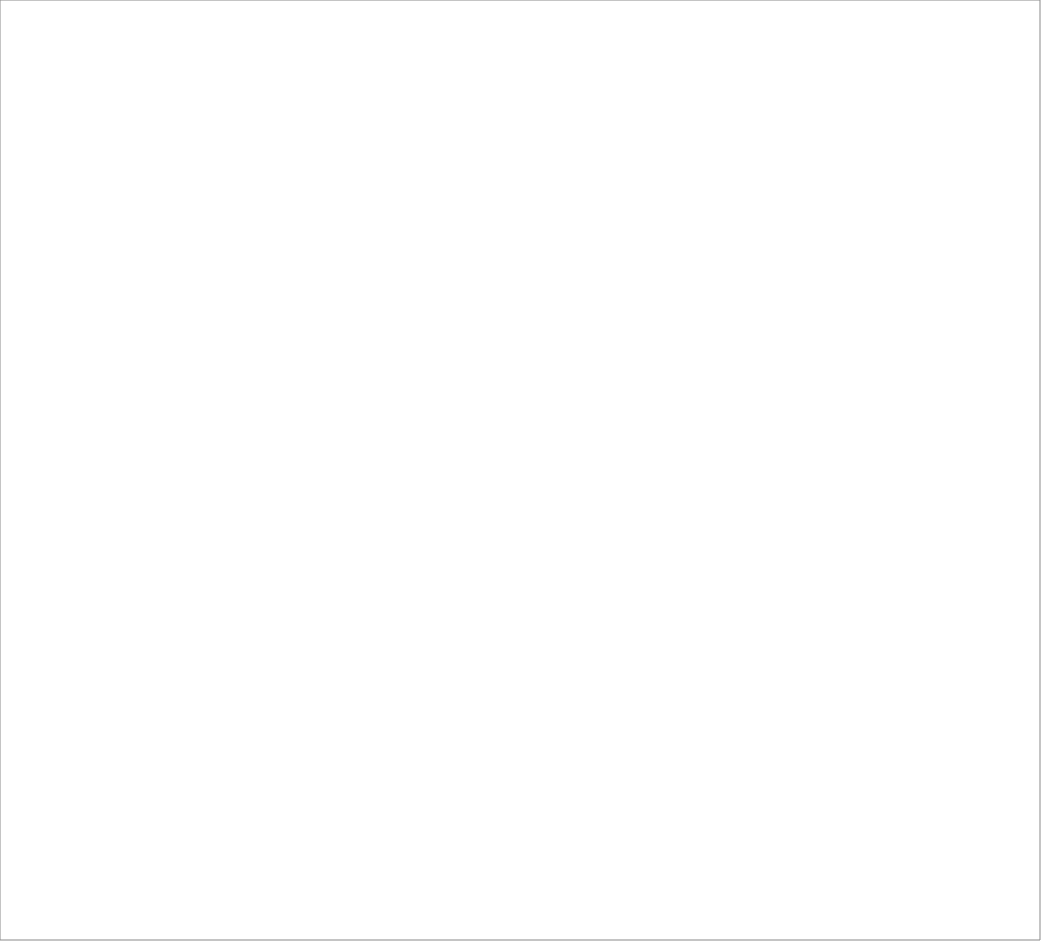
| Category | Liikenne-osion hiilijalanjälki |
|---|---|
| Lennot | 0 |
| Hotelliyöpymiset | 0 |
| Joukkoliikenne | 0 |
| Henkilöautot | 0 |
| Vuokrabussi | 0 |
| Taksi (koti- ja ulkomaat) | 0 |